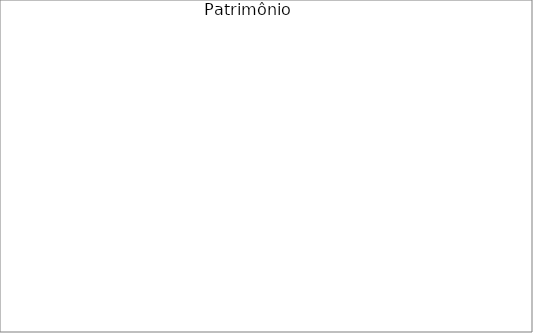
| Category | Series 0 |
|---|---|
| Imóveis uso próprio | 0 |
| Imóveis investimento | 0 |
| Aplicações | 0 |
| Aposentadoria/ previdência | 0 |
| Carros | 0 |
| Participações de empresas | 0 |
| Conta-corrente | 0 |